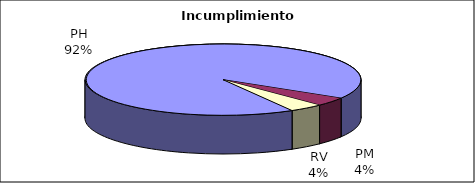
| Category | Efectivo |
|---|---|
| PH | 23 |
| PM | 1 |
| RV | 1 |